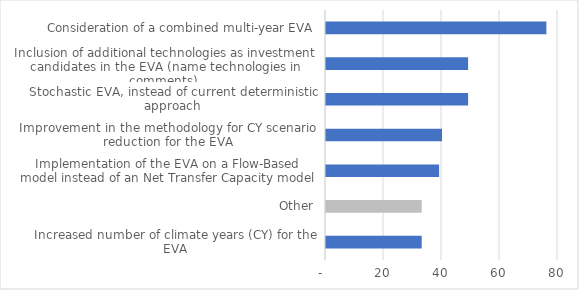
| Category | Priority score (highest = high priority) |
|---|---|
| Increased number of climate years (CY) for the EVA | 33 |
| Other | 33 |
| Implementation of the EVA on a Flow-Based model instead of an Net Transfer Capacity model | 39 |
| Improvement in the methodology for CY scenario reduction for the EVA | 40 |
| Stochastic EVA, instead of current deterministic approach | 49 |
| Inclusion of additional technologies as investment candidates in the EVA (name technologies in comments). | 49 |
| Consideration of a combined multi-year EVA | 76 |